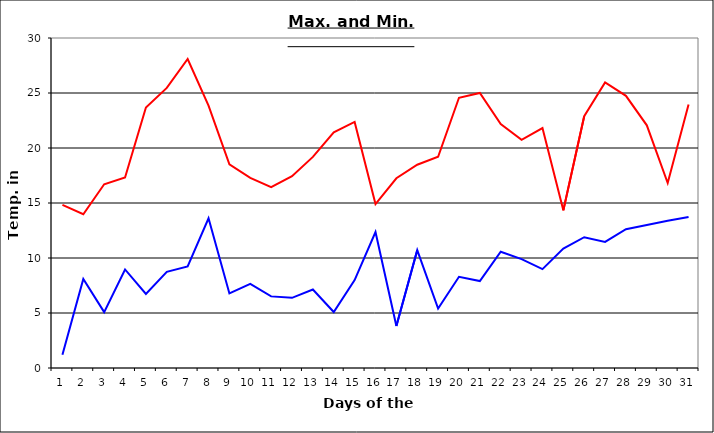
| Category | Series 0 | Series 1 |
|---|---|---|
| 0 | 14.83 | 1.2 |
| 1 | 13.98 | 8.1 |
| 2 | 16.7 | 5.08 |
| 3 | 17.32 | 8.96 |
| 4 | 23.68 | 6.73 |
| 5 | 25.46 | 8.74 |
| 6 | 28.09 | 9.23 |
| 7 | 23.85 | 13.61 |
| 8 | 18.51 | 6.78 |
| 9 | 17.29 | 7.65 |
| 10 | 16.44 | 6.51 |
| 11 | 17.44 | 6.38 |
| 12 | 19.19 | 7.14 |
| 13 | 21.43 | 5.09 |
| 14 | 22.37 | 7.99 |
| 15 | 14.9 | 12.36 |
| 16 | 17.25 | 3.81 |
| 17 | 18.48 | 10.71 |
| 18 | 19.2 | 5.41 |
| 19 | 24.57 | 8.29 |
| 20 | 25 | 7.9 |
| 21 | 22.18 | 10.57 |
| 22 | 20.75 | 9.9 |
| 23 | 21.81 | 8.99 |
| 24 | 14.33 | 10.85 |
| 25 | 22.89 | 11.89 |
| 26 | 25.96 | 11.46 |
| 27 | 24.74 | 12.62 |
| 28 | 22.06 | 13 |
| 29 | 16.82 | 13.38 |
| 30 | 23.96 | 13.73 |